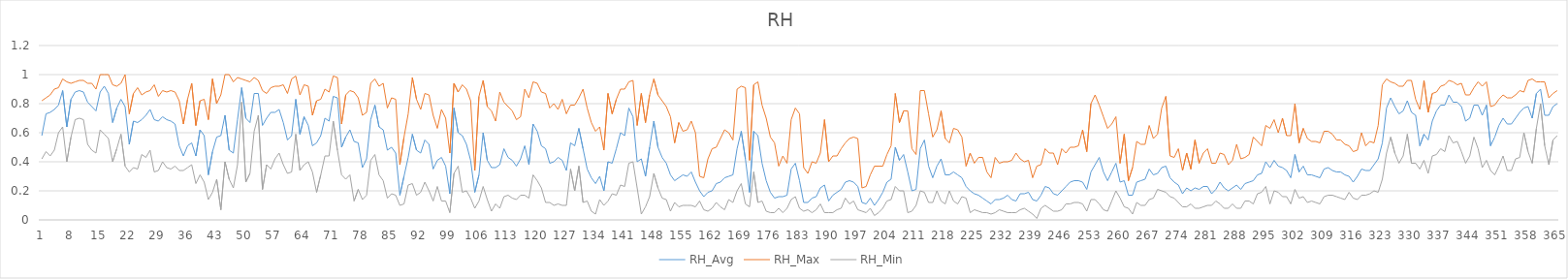
| Category | RH_Avg | RH_Max | RH_Min |
|---|---|---|---|
| 0 | 0.58 | 0.82 | 0.42 |
| 1 | 0.73 | 0.84 | 0.47 |
| 2 | 0.74 | 0.86 | 0.44 |
| 3 | 0.76 | 0.9 | 0.48 |
| 4 | 0.79 | 0.91 | 0.6 |
| 5 | 0.89 | 0.97 | 0.64 |
| 6 | 0.64 | 0.95 | 0.4 |
| 7 | 0.83 | 0.94 | 0.57 |
| 8 | 0.88 | 0.95 | 0.69 |
| 9 | 0.89 | 0.96 | 0.7 |
| 10 | 0.88 | 0.96 | 0.69 |
| 11 | 0.81 | 0.94 | 0.52 |
| 12 | 0.78 | 0.94 | 0.48 |
| 13 | 0.75 | 0.9 | 0.46 |
| 14 | 0.88 | 1 | 0.62 |
| 15 | 0.92 | 1 | 0.59 |
| 16 | 0.87 | 1 | 0.56 |
| 17 | 0.67 | 0.93 | 0.4 |
| 18 | 0.77 | 0.92 | 0.49 |
| 19 | 0.83 | 0.94 | 0.59 |
| 20 | 0.78 | 1 | 0.37 |
| 21 | 0.52 | 0.73 | 0.33 |
| 22 | 0.68 | 0.87 | 0.36 |
| 23 | 0.67 | 0.91 | 0.35 |
| 24 | 0.69 | 0.86 | 0.45 |
| 25 | 0.72 | 0.88 | 0.43 |
| 26 | 0.76 | 0.89 | 0.48 |
| 27 | 0.69 | 0.93 | 0.33 |
| 28 | 0.68 | 0.85 | 0.34 |
| 29 | 0.71 | 0.89 | 0.4 |
| 30 | 0.69 | 0.88 | 0.36 |
| 31 | 0.68 | 0.89 | 0.35 |
| 32 | 0.66 | 0.88 | 0.37 |
| 33 | 0.51 | 0.82 | 0.34 |
| 34 | 0.44 | 0.66 | 0.34 |
| 35 | 0.51 | 0.83 | 0.36 |
| 36 | 0.53 | 0.94 | 0.38 |
| 37 | 0.44 | 0.65 | 0.25 |
| 38 | 0.62 | 0.82 | 0.31 |
| 39 | 0.58 | 0.83 | 0.26 |
| 40 | 0.31 | 0.69 | 0.14 |
| 41 | 0.47 | 0.97 | 0.19 |
| 42 | 0.57 | 0.8 | 0.28 |
| 43 | 0.58 | 0.86 | 0.07 |
| 44 | 0.72 | 1 | 0.4 |
| 45 | 0.48 | 1 | 0.28 |
| 46 | 0.46 | 0.95 | 0.22 |
| 47 | 0.69 | 0.98 | 0.38 |
| 48 | 0.91 | 0.97 | 0.81 |
| 49 | 0.7 | 0.96 | 0.26 |
| 50 | 0.67 | 0.95 | 0.32 |
| 51 | 0.87 | 0.98 | 0.61 |
| 52 | 0.87 | 0.96 | 0.72 |
| 53 | 0.65 | 0.89 | 0.21 |
| 54 | 0.7 | 0.87 | 0.38 |
| 55 | 0.74 | 0.91 | 0.35 |
| 56 | 0.74 | 0.92 | 0.42 |
| 57 | 0.76 | 0.92 | 0.46 |
| 58 | 0.67 | 0.93 | 0.38 |
| 59 | 0.55 | 0.87 | 0.32 |
| 60 | 0.58 | 0.97 | 0.33 |
| 61 | 0.83 | 0.99 | 0.59 |
| 62 | 0.59 | 0.86 | 0.34 |
| 63 | 0.71 | 0.93 | 0.38 |
| 64 | 0.65 | 0.92 | 0.4 |
| 65 | 0.51 | 0.72 | 0.33 |
| 66 | 0.53 | 0.82 | 0.19 |
| 67 | 0.58 | 0.83 | 0.31 |
| 68 | 0.7 | 0.9 | 0.44 |
| 69 | 0.68 | 0.88 | 0.44 |
| 70 | 0.85 | 0.99 | 0.68 |
| 71 | 0.84 | 0.98 | 0.48 |
| 72 | 0.5 | 0.66 | 0.31 |
| 73 | 0.57 | 0.86 | 0.28 |
| 74 | 0.62 | 0.89 | 0.31 |
| 75 | 0.54 | 0.88 | 0.13 |
| 76 | 0.53 | 0.84 | 0.21 |
| 77 | 0.36 | 0.72 | 0.14 |
| 78 | 0.42 | 0.74 | 0.17 |
| 79 | 0.69 | 0.94 | 0.41 |
| 80 | 0.79 | 0.97 | 0.45 |
| 81 | 0.64 | 0.92 | 0.31 |
| 82 | 0.62 | 0.94 | 0.27 |
| 83 | 0.48 | 0.77 | 0.15 |
| 84 | 0.5 | 0.84 | 0.18 |
| 85 | 0.46 | 0.83 | 0.17 |
| 86 | 0.17 | 0.38 | 0.1 |
| 87 | 0.3 | 0.57 | 0.11 |
| 88 | 0.43 | 0.73 | 0.24 |
| 89 | 0.59 | 0.98 | 0.25 |
| 90 | 0.48 | 0.83 | 0.17 |
| 91 | 0.46 | 0.76 | 0.19 |
| 92 | 0.55 | 0.87 | 0.26 |
| 93 | 0.52 | 0.86 | 0.2 |
| 94 | 0.35 | 0.72 | 0.13 |
| 95 | 0.41 | 0.63 | 0.23 |
| 96 | 0.43 | 0.76 | 0.13 |
| 97 | 0.37 | 0.7 | 0.13 |
| 98 | 0.18 | 0.46 | 0.05 |
| 99 | 0.77 | 0.94 | 0.32 |
| 100 | 0.6 | 0.88 | 0.37 |
| 101 | 0.58 | 0.93 | 0.19 |
| 102 | 0.52 | 0.9 | 0.2 |
| 103 | 0.41 | 0.82 | 0.15 |
| 104 | 0.19 | 0.34 | 0.08 |
| 105 | 0.31 | 0.85 | 0.13 |
| 106 | 0.6 | 0.96 | 0.23 |
| 107 | 0.41 | 0.78 | 0.14 |
| 108 | 0.36 | 0.75 | 0.06 |
| 109 | 0.36 | 0.68 | 0.11 |
| 110 | 0.38 | 0.88 | 0.08 |
| 111 | 0.49 | 0.81 | 0.16 |
| 112 | 0.43 | 0.78 | 0.17 |
| 113 | 0.41 | 0.75 | 0.15 |
| 114 | 0.37 | 0.69 | 0.14 |
| 115 | 0.42 | 0.71 | 0.17 |
| 116 | 0.51 | 0.9 | 0.17 |
| 117 | 0.38 | 0.84 | 0.15 |
| 118 | 0.66 | 0.95 | 0.31 |
| 119 | 0.61 | 0.94 | 0.27 |
| 120 | 0.51 | 0.88 | 0.22 |
| 121 | 0.49 | 0.87 | 0.12 |
| 122 | 0.39 | 0.77 | 0.12 |
| 123 | 0.4 | 0.8 | 0.1 |
| 124 | 0.43 | 0.76 | 0.11 |
| 125 | 0.41 | 0.83 | 0.1 |
| 126 | 0.34 | 0.73 | 0.1 |
| 127 | 0.53 | 0.79 | 0.35 |
| 128 | 0.51 | 0.79 | 0.2 |
| 129 | 0.63 | 0.84 | 0.37 |
| 130 | 0.49 | 0.9 | 0.12 |
| 131 | 0.35 | 0.77 | 0.13 |
| 132 | 0.29 | 0.67 | 0.06 |
| 133 | 0.25 | 0.61 | 0.04 |
| 134 | 0.3 | 0.64 | 0.14 |
| 135 | 0.2 | 0.48 | 0.1 |
| 136 | 0.4 | 0.87 | 0.13 |
| 137 | 0.39 | 0.73 | 0.18 |
| 138 | 0.49 | 0.83 | 0.17 |
| 139 | 0.6 | 0.9 | 0.24 |
| 140 | 0.58 | 0.9 | 0.23 |
| 141 | 0.77 | 0.95 | 0.39 |
| 142 | 0.71 | 0.96 | 0.4 |
| 143 | 0.4 | 0.65 | 0.22 |
| 144 | 0.42 | 0.87 | 0.04 |
| 145 | 0.3 | 0.67 | 0.09 |
| 146 | 0.5 | 0.86 | 0.16 |
| 147 | 0.68 | 0.97 | 0.32 |
| 148 | 0.5 | 0.86 | 0.22 |
| 149 | 0.43 | 0.82 | 0.15 |
| 150 | 0.39 | 0.78 | 0.14 |
| 151 | 0.31 | 0.71 | 0.06 |
| 152 | 0.27 | 0.53 | 0.12 |
| 153 | 0.29 | 0.67 | 0.09 |
| 154 | 0.31 | 0.61 | 0.1 |
| 155 | 0.3 | 0.62 | 0.1 |
| 156 | 0.33 | 0.68 | 0.1 |
| 157 | 0.26 | 0.6 | 0.09 |
| 158 | 0.2 | 0.3 | 0.13 |
| 159 | 0.16 | 0.29 | 0.07 |
| 160 | 0.19 | 0.42 | 0.06 |
| 161 | 0.2 | 0.49 | 0.08 |
| 162 | 0.25 | 0.5 | 0.12 |
| 163 | 0.26 | 0.56 | 0.09 |
| 164 | 0.29 | 0.62 | 0.07 |
| 165 | 0.3 | 0.6 | 0.14 |
| 166 | 0.31 | 0.55 | 0.12 |
| 167 | 0.49 | 0.9 | 0.2 |
| 168 | 0.61 | 0.92 | 0.25 |
| 169 | 0.42 | 0.91 | 0.11 |
| 170 | 0.19 | 0.41 | 0.09 |
| 171 | 0.61 | 0.93 | 0.33 |
| 172 | 0.58 | 0.95 | 0.12 |
| 173 | 0.39 | 0.79 | 0.13 |
| 174 | 0.27 | 0.7 | 0.06 |
| 175 | 0.19 | 0.57 | 0.05 |
| 176 | 0.15 | 0.53 | 0.05 |
| 177 | 0.16 | 0.37 | 0.08 |
| 178 | 0.16 | 0.44 | 0.05 |
| 179 | 0.17 | 0.39 | 0.08 |
| 180 | 0.35 | 0.69 | 0.14 |
| 181 | 0.39 | 0.77 | 0.16 |
| 182 | 0.27 | 0.73 | 0.08 |
| 183 | 0.12 | 0.36 | 0.06 |
| 184 | 0.12 | 0.32 | 0.07 |
| 185 | 0.15 | 0.4 | 0.05 |
| 186 | 0.16 | 0.39 | 0.07 |
| 187 | 0.22 | 0.46 | 0.11 |
| 188 | 0.24 | 0.69 | 0.05 |
| 189 | 0.13 | 0.4 | 0.05 |
| 190 | 0.17 | 0.44 | 0.05 |
| 191 | 0.19 | 0.44 | 0.07 |
| 192 | 0.21 | 0.49 | 0.08 |
| 193 | 0.26 | 0.53 | 0.15 |
| 194 | 0.27 | 0.56 | 0.11 |
| 195 | 0.26 | 0.57 | 0.13 |
| 196 | 0.23 | 0.56 | 0.07 |
| 197 | 0.12 | 0.22 | 0.06 |
| 198 | 0.11 | 0.23 | 0.05 |
| 199 | 0.15 | 0.31 | 0.08 |
| 200 | 0.1 | 0.37 | 0.03 |
| 201 | 0.14 | 0.37 | 0.05 |
| 202 | 0.19 | 0.37 | 0.08 |
| 203 | 0.26 | 0.45 | 0.13 |
| 204 | 0.28 | 0.51 | 0.14 |
| 205 | 0.5 | 0.87 | 0.23 |
| 206 | 0.41 | 0.67 | 0.2 |
| 207 | 0.45 | 0.75 | 0.2 |
| 208 | 0.33 | 0.75 | 0.05 |
| 209 | 0.2 | 0.49 | 0.06 |
| 210 | 0.21 | 0.45 | 0.1 |
| 211 | 0.49 | 0.89 | 0.2 |
| 212 | 0.55 | 0.89 | 0.19 |
| 213 | 0.37 | 0.73 | 0.12 |
| 214 | 0.29 | 0.57 | 0.12 |
| 215 | 0.37 | 0.62 | 0.2 |
| 216 | 0.42 | 0.75 | 0.13 |
| 217 | 0.31 | 0.56 | 0.11 |
| 218 | 0.31 | 0.53 | 0.2 |
| 219 | 0.33 | 0.63 | 0.13 |
| 220 | 0.31 | 0.62 | 0.11 |
| 221 | 0.29 | 0.57 | 0.16 |
| 222 | 0.23 | 0.37 | 0.15 |
| 223 | 0.2 | 0.46 | 0.05 |
| 224 | 0.18 | 0.39 | 0.07 |
| 225 | 0.17 | 0.43 | 0.06 |
| 226 | 0.15 | 0.43 | 0.05 |
| 227 | 0.13 | 0.33 | 0.05 |
| 228 | 0.11 | 0.29 | 0.04 |
| 229 | 0.14 | 0.43 | 0.05 |
| 230 | 0.14 | 0.39 | 0.07 |
| 231 | 0.15 | 0.4 | 0.06 |
| 232 | 0.17 | 0.4 | 0.05 |
| 233 | 0.14 | 0.41 | 0.05 |
| 234 | 0.13 | 0.46 | 0.05 |
| 235 | 0.18 | 0.42 | 0.07 |
| 236 | 0.18 | 0.4 | 0.08 |
| 237 | 0.19 | 0.41 | 0.06 |
| 238 | 0.14 | 0.29 | 0.04 |
| 239 | 0.13 | 0.37 | 0.01 |
| 240 | 0.17 | 0.38 | 0.08 |
| 241 | 0.23 | 0.49 | 0.1 |
| 242 | 0.22 | 0.46 | 0.08 |
| 243 | 0.18 | 0.46 | 0.06 |
| 244 | 0.17 | 0.38 | 0.06 |
| 245 | 0.2 | 0.49 | 0.07 |
| 246 | 0.23 | 0.46 | 0.11 |
| 247 | 0.26 | 0.5 | 0.11 |
| 248 | 0.27 | 0.5 | 0.12 |
| 249 | 0.27 | 0.51 | 0.12 |
| 250 | 0.26 | 0.62 | 0.11 |
| 251 | 0.21 | 0.47 | 0.06 |
| 252 | 0.33 | 0.8 | 0.14 |
| 253 | 0.38 | 0.86 | 0.14 |
| 254 | 0.43 | 0.79 | 0.11 |
| 255 | 0.33 | 0.71 | 0.07 |
| 256 | 0.27 | 0.63 | 0.06 |
| 257 | 0.33 | 0.66 | 0.13 |
| 258 | 0.39 | 0.71 | 0.2 |
| 259 | 0.26 | 0.39 | 0.15 |
| 260 | 0.27 | 0.59 | 0.09 |
| 261 | 0.17 | 0.27 | 0.08 |
| 262 | 0.17 | 0.36 | 0.04 |
| 263 | 0.26 | 0.54 | 0.12 |
| 264 | 0.27 | 0.52 | 0.1 |
| 265 | 0.28 | 0.52 | 0.1 |
| 266 | 0.35 | 0.65 | 0.14 |
| 267 | 0.31 | 0.56 | 0.15 |
| 268 | 0.32 | 0.59 | 0.21 |
| 269 | 0.36 | 0.77 | 0.2 |
| 270 | 0.37 | 0.85 | 0.19 |
| 271 | 0.29 | 0.44 | 0.16 |
| 272 | 0.26 | 0.43 | 0.15 |
| 273 | 0.24 | 0.49 | 0.12 |
| 274 | 0.18 | 0.34 | 0.09 |
| 275 | 0.22 | 0.46 | 0.09 |
| 276 | 0.2 | 0.35 | 0.11 |
| 277 | 0.22 | 0.55 | 0.08 |
| 278 | 0.21 | 0.39 | 0.08 |
| 279 | 0.23 | 0.46 | 0.09 |
| 280 | 0.23 | 0.49 | 0.1 |
| 281 | 0.18 | 0.39 | 0.1 |
| 282 | 0.21 | 0.39 | 0.13 |
| 283 | 0.26 | 0.46 | 0.11 |
| 284 | 0.22 | 0.45 | 0.08 |
| 285 | 0.2 | 0.38 | 0.08 |
| 286 | 0.22 | 0.41 | 0.11 |
| 287 | 0.24 | 0.52 | 0.08 |
| 288 | 0.21 | 0.42 | 0.08 |
| 289 | 0.25 | 0.43 | 0.13 |
| 290 | 0.26 | 0.45 | 0.13 |
| 291 | 0.27 | 0.57 | 0.11 |
| 292 | 0.31 | 0.54 | 0.18 |
| 293 | 0.32 | 0.51 | 0.19 |
| 294 | 0.4 | 0.65 | 0.23 |
| 295 | 0.36 | 0.63 | 0.11 |
| 296 | 0.41 | 0.69 | 0.2 |
| 297 | 0.37 | 0.6 | 0.19 |
| 298 | 0.36 | 0.7 | 0.16 |
| 299 | 0.34 | 0.58 | 0.16 |
| 300 | 0.29 | 0.58 | 0.11 |
| 301 | 0.45 | 0.8 | 0.21 |
| 302 | 0.33 | 0.53 | 0.15 |
| 303 | 0.37 | 0.63 | 0.16 |
| 304 | 0.31 | 0.56 | 0.12 |
| 305 | 0.31 | 0.54 | 0.13 |
| 306 | 0.3 | 0.54 | 0.12 |
| 307 | 0.29 | 0.53 | 0.11 |
| 308 | 0.35 | 0.61 | 0.16 |
| 309 | 0.36 | 0.61 | 0.17 |
| 310 | 0.34 | 0.59 | 0.17 |
| 311 | 0.33 | 0.55 | 0.16 |
| 312 | 0.33 | 0.55 | 0.15 |
| 313 | 0.31 | 0.52 | 0.14 |
| 314 | 0.3 | 0.51 | 0.19 |
| 315 | 0.26 | 0.47 | 0.15 |
| 316 | 0.3 | 0.48 | 0.14 |
| 317 | 0.35 | 0.6 | 0.17 |
| 318 | 0.34 | 0.51 | 0.17 |
| 319 | 0.34 | 0.54 | 0.18 |
| 320 | 0.38 | 0.53 | 0.2 |
| 321 | 0.42 | 0.65 | 0.19 |
| 322 | 0.53 | 0.93 | 0.28 |
| 323 | 0.77 | 0.97 | 0.46 |
| 324 | 0.84 | 0.95 | 0.57 |
| 325 | 0.78 | 0.94 | 0.46 |
| 326 | 0.73 | 0.92 | 0.39 |
| 327 | 0.75 | 0.92 | 0.44 |
| 328 | 0.82 | 0.96 | 0.59 |
| 329 | 0.74 | 0.96 | 0.39 |
| 330 | 0.72 | 0.83 | 0.39 |
| 331 | 0.51 | 0.76 | 0.35 |
| 332 | 0.59 | 0.96 | 0.41 |
| 333 | 0.55 | 0.74 | 0.32 |
| 334 | 0.68 | 0.87 | 0.44 |
| 335 | 0.75 | 0.88 | 0.45 |
| 336 | 0.79 | 0.92 | 0.49 |
| 337 | 0.79 | 0.93 | 0.47 |
| 338 | 0.86 | 0.96 | 0.58 |
| 339 | 0.81 | 0.95 | 0.53 |
| 340 | 0.81 | 0.93 | 0.54 |
| 341 | 0.78 | 0.94 | 0.47 |
| 342 | 0.68 | 0.86 | 0.39 |
| 343 | 0.7 | 0.86 | 0.44 |
| 344 | 0.79 | 0.91 | 0.57 |
| 345 | 0.79 | 0.95 | 0.49 |
| 346 | 0.72 | 0.92 | 0.36 |
| 347 | 0.79 | 0.95 | 0.41 |
| 348 | 0.51 | 0.78 | 0.34 |
| 349 | 0.57 | 0.79 | 0.31 |
| 350 | 0.65 | 0.83 | 0.37 |
| 351 | 0.7 | 0.86 | 0.44 |
| 352 | 0.66 | 0.84 | 0.34 |
| 353 | 0.66 | 0.84 | 0.34 |
| 354 | 0.7 | 0.86 | 0.42 |
| 355 | 0.74 | 0.89 | 0.43 |
| 356 | 0.77 | 0.88 | 0.6 |
| 357 | 0.78 | 0.96 | 0.47 |
| 358 | 0.7 | 0.97 | 0.39 |
| 359 | 0.87 | 0.95 | 0.63 |
| 360 | 0.9 | 0.95 | 0.8 |
| 361 | 0.72 | 0.95 | 0.51 |
| 362 | 0.72 | 0.84 | 0.38 |
| 363 | 0.78 | 0.87 | 0.55 |
| 364 | 0.8 | 0.89 | 0.58 |